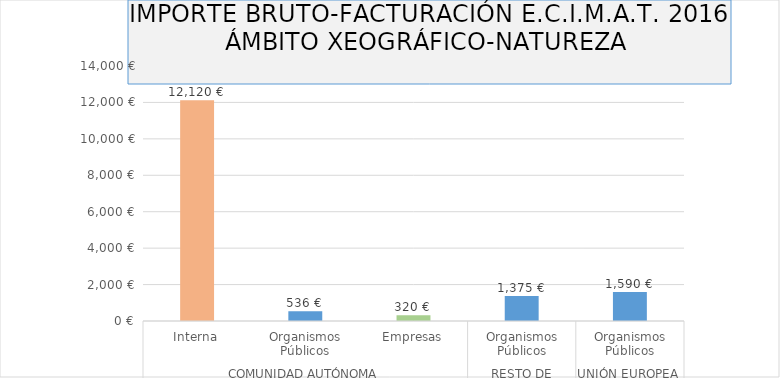
| Category | Series 0 |
|---|---|
| 0 | 12120.41 |
| 1 | 536.24 |
| 2 | 319.99 |
| 3 | 1375 |
| 4 | 1590 |